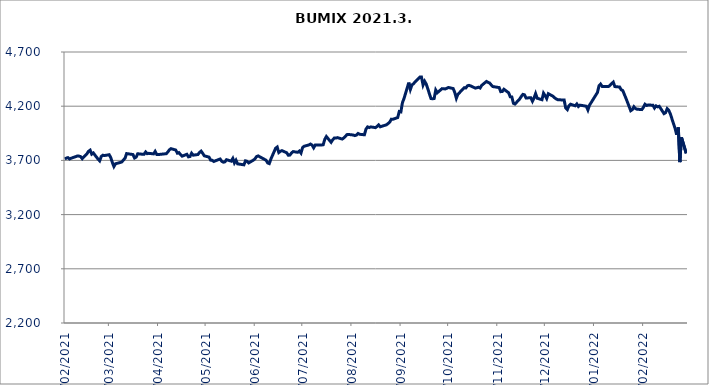
| Category | BUMIX |
|---|---|
| 01/02/2021 | 3713.3 |
| 02/02/2021 | 3721.16 |
| 03/02/2021 | 3725.78 |
| 04/02/2021 | 3713.5 |
| 05/02/2021 | 3720.14 |
| 08/02/2021 | 3735.17 |
| 09/02/2021 | 3741.05 |
| 10/02/2021 | 3739.45 |
| 11/02/2021 | 3735 |
| 12/02/2021 | 3716.17 |
| 15/02/2021 | 3761.64 |
| 16/02/2021 | 3784.64 |
| 17/02/2021 | 3794.47 |
| 18/02/2021 | 3757.86 |
| 19/02/2021 | 3768.62 |
| 22/02/2021 | 3711.29 |
| 23/02/2021 | 3696.27 |
| 24/02/2021 | 3736.18 |
| 25/02/2021 | 3747.99 |
| 26/02/2021 | 3744.67 |
| 01/03/2021 | 3752.44 |
| 02/03/2021 | 3726.66 |
| 03/03/2021 | 3680.33 |
| 04/03/2021 | 3643.62 |
| 05/03/2021 | 3669.15 |
| 08/03/2021 | 3680.69 |
| 09/03/2021 | 3686.14 |
| 10/03/2021 | 3703.66 |
| 11/03/2021 | 3720.43 |
| 12/03/2021 | 3762.99 |
| 16/03/2021 | 3753.85 |
| 17/03/2021 | 3722.11 |
| 18/03/2021 | 3730.13 |
| 19/03/2021 | 3761.3 |
| 22/03/2021 | 3756.8 |
| 23/03/2021 | 3756.18 |
| 24/03/2021 | 3778.02 |
| 25/03/2021 | 3762.1 |
| 26/03/2021 | 3765.17 |
| 29/03/2021 | 3760.12 |
| 30/03/2021 | 3782.9 |
| 31/03/2021 | 3754.86 |
| 01/04/2021 | 3754.04 |
| 06/04/2021 | 3761.95 |
| 07/04/2021 | 3777.27 |
| 08/04/2021 | 3798.2 |
| 09/04/2021 | 3808.26 |
| 12/04/2021 | 3795.78 |
| 13/04/2021 | 3766.75 |
| 14/04/2021 | 3771.86 |
| 15/04/2021 | 3753.41 |
| 16/04/2021 | 3738.77 |
| 19/04/2021 | 3756.43 |
| 20/04/2021 | 3732.67 |
| 21/04/2021 | 3736.16 |
| 22/04/2021 | 3766.06 |
| 23/04/2021 | 3747.88 |
| 26/04/2021 | 3754.41 |
| 27/04/2021 | 3774.04 |
| 28/04/2021 | 3785.46 |
| 29/04/2021 | 3764.89 |
| 30/04/2021 | 3742.28 |
| 03/05/2021 | 3730.11 |
| 04/05/2021 | 3702.37 |
| 05/05/2021 | 3700.76 |
| 06/05/2021 | 3690.24 |
| 07/05/2021 | 3696.3 |
| 10/05/2021 | 3712.94 |
| 11/05/2021 | 3692.08 |
| 12/05/2021 | 3683.66 |
| 13/05/2021 | 3686.36 |
| 14/05/2021 | 3706.54 |
| 17/05/2021 | 3693.36 |
| 18/05/2021 | 3718.14 |
| 19/05/2021 | 3676.61 |
| 20/05/2021 | 3701.45 |
| 21/05/2021 | 3667.93 |
| 25/05/2021 | 3659.42 |
| 26/05/2021 | 3695.97 |
| 27/05/2021 | 3691.66 |
| 28/05/2021 | 3676.84 |
| 31/05/2021 | 3702.72 |
| 01/06/2021 | 3715.57 |
| 02/06/2021 | 3735.73 |
| 03/06/2021 | 3741.61 |
| 04/06/2021 | 3733.15 |
| 07/06/2021 | 3709.46 |
| 08/06/2021 | 3700.79 |
| 09/06/2021 | 3676.16 |
| 10/06/2021 | 3670.48 |
| 11/06/2021 | 3712.42 |
| 14/06/2021 | 3812.06 |
| 15/06/2021 | 3823.15 |
| 16/06/2021 | 3772.74 |
| 17/06/2021 | 3784 |
| 18/06/2021 | 3789.98 |
| 21/06/2021 | 3770.52 |
| 22/06/2021 | 3747.49 |
| 23/06/2021 | 3749.3 |
| 24/06/2021 | 3767.66 |
| 25/06/2021 | 3781.28 |
| 28/06/2021 | 3774.78 |
| 29/06/2021 | 3786.58 |
| 30/06/2021 | 3767.61 |
| 01/07/2021 | 3818.34 |
| 02/07/2021 | 3830.52 |
| 05/07/2021 | 3842.74 |
| 06/07/2021 | 3850.72 |
| 07/07/2021 | 3840.93 |
| 08/07/2021 | 3816.21 |
| 09/07/2021 | 3841.96 |
| 12/07/2021 | 3842.91 |
| 13/07/2021 | 3842.17 |
| 14/07/2021 | 3844.48 |
| 15/07/2021 | 3893.9 |
| 16/07/2021 | 3920.28 |
| 19/07/2021 | 3867.14 |
| 20/07/2021 | 3890.16 |
| 21/07/2021 | 3906.3 |
| 22/07/2021 | 3905.88 |
| 23/07/2021 | 3910.05 |
| 26/07/2021 | 3897.02 |
| 27/07/2021 | 3907.07 |
| 28/07/2021 | 3922 |
| 29/07/2021 | 3937.81 |
| 30/07/2021 | 3939.4 |
| 02/08/2021 | 3934.13 |
| 03/08/2021 | 3929.12 |
| 04/08/2021 | 3933.57 |
| 05/08/2021 | 3948.67 |
| 06/08/2021 | 3940.84 |
| 09/08/2021 | 3936.39 |
| 10/08/2021 | 3988.56 |
| 11/08/2021 | 4008.96 |
| 12/08/2021 | 4002.87 |
| 13/08/2021 | 4009.14 |
| 16/08/2021 | 4002.18 |
| 17/08/2021 | 4013.31 |
| 18/08/2021 | 4027.31 |
| 19/08/2021 | 4009.73 |
| 23/08/2021 | 4029.07 |
| 24/08/2021 | 4041.06 |
| 25/08/2021 | 4053.57 |
| 26/08/2021 | 4080.45 |
| 27/08/2021 | 4079.53 |
| 30/08/2021 | 4095.22 |
| 31/08/2021 | 4151.22 |
| 01/09/2021 | 4147.64 |
| 02/09/2021 | 4233.18 |
| 03/09/2021 | 4271.59 |
| 06/09/2021 | 4417.57 |
| 07/09/2021 | 4354.49 |
| 08/09/2021 | 4395.86 |
| 09/09/2021 | 4407.76 |
| 10/09/2021 | 4424.38 |
| 13/09/2021 | 4468.47 |
| 14/09/2021 | 4468.74 |
| 15/09/2021 | 4395.2 |
| 16/09/2021 | 4429.91 |
| 17/09/2021 | 4404.2 |
| 20/09/2021 | 4270.78 |
| 21/09/2021 | 4268.42 |
| 22/09/2021 | 4270.89 |
| 23/09/2021 | 4349.07 |
| 24/09/2021 | 4324.31 |
| 27/09/2021 | 4362.09 |
| 28/09/2021 | 4360.92 |
| 29/09/2021 | 4358.99 |
| 30/09/2021 | 4365.64 |
| 01/10/2021 | 4372.74 |
| 04/10/2021 | 4362.94 |
| 05/10/2021 | 4326.82 |
| 06/10/2021 | 4273.07 |
| 07/10/2021 | 4310.14 |
| 08/10/2021 | 4325.13 |
| 11/10/2021 | 4371.07 |
| 12/10/2021 | 4368.19 |
| 13/10/2021 | 4388.26 |
| 14/10/2021 | 4392.24 |
| 15/10/2021 | 4387.15 |
| 18/10/2021 | 4366.68 |
| 19/10/2021 | 4370.65 |
| 20/10/2021 | 4375.2 |
| 21/10/2021 | 4367.75 |
| 22/10/2021 | 4392.46 |
| 25/10/2021 | 4428.31 |
| 26/10/2021 | 4419.51 |
| 27/10/2021 | 4414.15 |
| 28/10/2021 | 4396.35 |
| 29/10/2021 | 4381.14 |
| 02/11/2021 | 4371.95 |
| 03/11/2021 | 4334.22 |
| 04/11/2021 | 4335.89 |
| 05/11/2021 | 4356.33 |
| 08/11/2021 | 4323.72 |
| 09/11/2021 | 4286.95 |
| 10/11/2021 | 4285.37 |
| 11/11/2021 | 4226.99 |
| 12/11/2021 | 4219.97 |
| 15/11/2021 | 4267.57 |
| 16/11/2021 | 4290.72 |
| 17/11/2021 | 4308.88 |
| 18/11/2021 | 4305.32 |
| 19/11/2021 | 4275.83 |
| 22/11/2021 | 4277.83 |
| 23/11/2021 | 4245.77 |
| 24/11/2021 | 4275.81 |
| 25/11/2021 | 4316.18 |
| 26/11/2021 | 4273.42 |
| 29/11/2021 | 4260.04 |
| 30/11/2021 | 4320.18 |
| 01/12/2021 | 4297.37 |
| 02/12/2021 | 4270.44 |
| 03/12/2021 | 4315.39 |
| 06/12/2021 | 4291.58 |
| 07/12/2021 | 4277.37 |
| 08/12/2021 | 4266.9 |
| 09/12/2021 | 4259.57 |
| 10/12/2021 | 4258.95 |
| 13/12/2021 | 4256.89 |
| 14/12/2021 | 4182.68 |
| 15/12/2021 | 4167.99 |
| 16/12/2021 | 4203.45 |
| 17/12/2021 | 4218.74 |
| 20/12/2021 | 4203.79 |
| 21/12/2021 | 4220.66 |
| 22/12/2021 | 4197.58 |
| 23/12/2021 | 4209.89 |
| 27/12/2021 | 4199.65 |
| 28/12/2021 | 4165.48 |
| 29/12/2021 | 4209.66 |
| 30/12/2021 | 4232.45 |
| 03/01/2022 | 4326.64 |
| 04/01/2022 | 4388.32 |
| 05/01/2022 | 4404.2 |
| 06/01/2022 | 4382.17 |
| 07/01/2022 | 4382.58 |
| 10/01/2022 | 4381.19 |
| 11/01/2022 | 4394.39 |
| 12/01/2022 | 4408.77 |
| 13/01/2022 | 4421.96 |
| 14/01/2022 | 4380.91 |
| 17/01/2022 | 4376.9 |
| 18/01/2022 | 4351.82 |
| 19/01/2022 | 4344.07 |
| 20/01/2022 | 4308.05 |
| 21/01/2022 | 4272.85 |
| 24/01/2022 | 4158.45 |
| 25/01/2022 | 4168.17 |
| 26/01/2022 | 4194.84 |
| 27/01/2022 | 4177.94 |
| 28/01/2022 | 4172.22 |
| 31/01/2022 | 4168.76 |
| 01/02/2022 | 4189.4 |
| 02/02/2022 | 4217.95 |
| 03/02/2022 | 4206.58 |
| 04/02/2022 | 4211.13 |
| 07/02/2022 | 4209 |
| 08/02/2022 | 4183.07 |
| 09/02/2022 | 4202.77 |
| 10/02/2022 | 4194.07 |
| 11/02/2022 | 4199.2 |
| 14/02/2022 | 4131.52 |
| 15/02/2022 | 4140.47 |
| 16/02/2022 | 4177.18 |
| 17/02/2022 | 4161.67 |
| 18/02/2022 | 4128.63 |
| 21/02/2022 | 3993.64 |
| 22/02/2022 | 3936.35 |
| 23/02/2022 | 4004.05 |
| 24/02/2022 | 3684.09 |
| 25/02/2022 | 3912.97 |
| 28/02/2022 | 3765.1 |